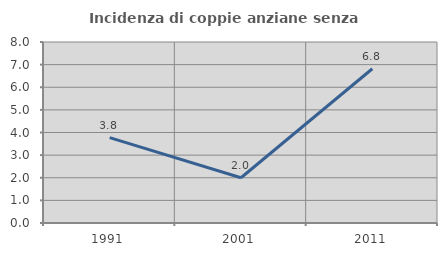
| Category | Incidenza di coppie anziane senza figli  |
|---|---|
| 1991.0 | 3.774 |
| 2001.0 | 2 |
| 2011.0 | 6.818 |